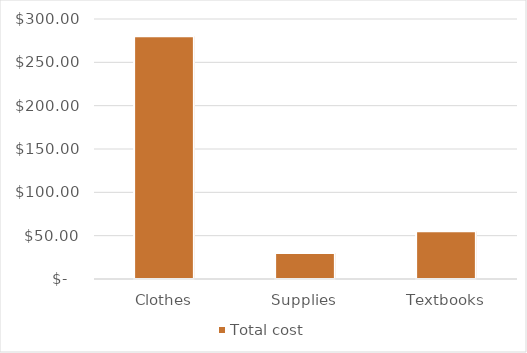
| Category | Total cost |
|---|---|
| Clothes | 280 |
| Supplies | 30 |
| Textbooks | 55 |